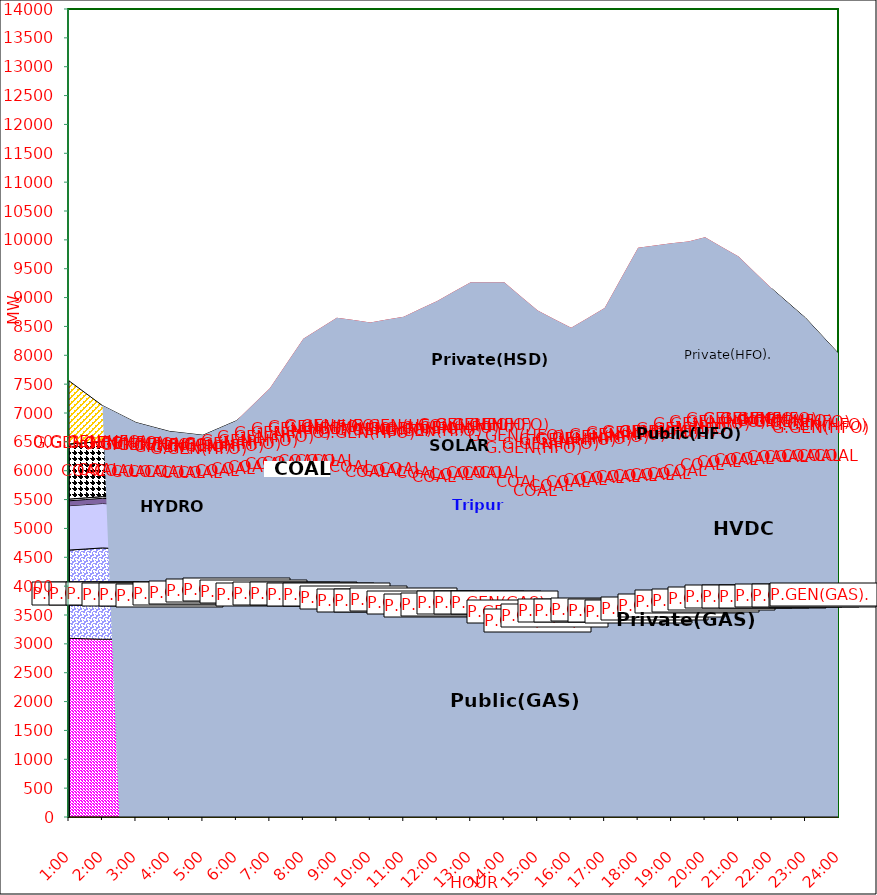
| Category | GAS | P.GEN(GAS). |  HVDC | TRIPURA | HYDRO | COAL | SOLAR | G.GEN(HFO) | P.GEN(HFO). | G.GEN(HSD) | P.GEN(HSD) | SHORTAGE | Total Energy Gen 194.744 MKWHr 
Energy Not Served   10.082 MKWHr 
Energy Requirement     204.826 MKWHr  |
|---|---|---|---|---|---|---|---|---|---|---|---|---|---|
| 1:00 | 3096 | 1529 | 769 | 84 | 30 | 955 | 0 | 0 | 1094 | 0 | 0 | 0 |  |
| 1:30 | 3088 | 1555.5 | 769.5 | 87 | 30 | 955 | 0 | 0 | 857.5 | 0 | 0 | 0 |  |
| 2:00 | 3080 | 1582 | 770 | 90 | 30 | 955 | 0 | 0 | 621 | 0 | 0 | 0 |  |
| 2:30 | 3080.5 | 1567 | 769.5 | 85 | 30 | 955.5 | 0 | 0 | 494 | 0 | 0 | 0 |  |
| 3:00 | 3081 | 1552 | 769 | 80 | 30 | 956 | 0 | 0 | 367 | 0 | 0 | 0 |  |
| 3:30 | 3071.5 | 1558 | 769 | 82 | 30 | 950 | 0 | 0 | 297.5 | 0 | 0 | 0 |  |
| 4:00 | 3062 | 1564 | 769 | 84 | 30 | 944 | 0 | 0 | 228 | 0 | 0 | 0 |  |
| 4:30 | 3088.5 | 1558.5 | 769 | 85 | 30 | 889 | 0 | 0 | 228 | 0 | 0 | 0 |  |
| 5:00 | 3115 | 1553 | 769 | 86 | 30 | 834 | 0 | 0 | 228 | 0 | 0 | 0 |  |
| 5:30 | 3133 | 1568.5 | 769 | 83 | 30 | 844.5 | 0 | 2.5 | 309.5 | 0 | 0 | 0 |  |
| 6:00 | 3151 | 1584 | 769 | 80 | 30 | 855 | 0 | 5 | 391 | 0 | 0 | 0 |  |
| 6:30 | 3118 | 1566 | 840 | 84 | 30 | 884.5 | 1.5 | 14.5 | 562 | 0 | 0 | 46.079 |  |
| 7:00 | 3085 | 1548 | 911 | 88 | 30 | 914 | 3 | 24 | 733 | 0 | 0 | 92.158 |  |
| 7:30 | 3083.5 | 1562.5 | 911 | 93 | 30 | 935.5 | 25.5 | 36 | 825 | 0 | 0 | 356.189 |  |
| 8:00 | 3082 | 1577 | 911 | 98 | 30 | 957 | 48 | 48 | 917 | 0 | 0 | 620.22 |  |
| 8:30 | 3069 | 1586 | 910 | 100 | 30 | 956.5 | 79 | 54.5 | 954 | 0 | 0 | 729.887 |  |
| 9:00 | 3056 | 1595 | 909 | 102 | 30 | 956 | 110 | 61 | 991 | 0 | 0 | 839.555 |  |
| 9:30 | 3042 | 1516 | 909 | 99 | 30 | 956 | 142.5 | 64.5 | 1032 | 0 | 0 | 818.819 |  |
| 10:00 | 3028 | 1437 | 909 | 96 | 30 | 956 | 175 | 68 | 1073 | 0 | 0 | 798.084 |  |
| 10:30 | 3024.5 | 1464.5 | 909 | 100 | 30 | 955.5 | 205 | 66.5 | 1122.5 | 0 | 0 | 740.946 |  |
| 11:00 | 3021 | 1492 | 909 | 104 | 30 | 955 | 235 | 65 | 1172 | 0 | 0 | 683.809 |  |
| 11:30 | 2975.5 | 1473 | 909 | 105 | 30 | 955.5 | 252 | 73.5 | 1131 | 0 | 45 | 855.222 |  |
| 12:00 | 2930 | 1454 | 909 | 106 | 30 | 956 | 269 | 82 | 1090 | 0 | 90 | 1026.635 |  |
| 12:30 | 2956.5 | 1455.5 | 909 | 108 | 30 | 955.5 | 287.5 | 89 | 1083 | 0 | 89.5 | 1140.91 |  |
| 13:00 | 2983 | 1457 | 909 | 110 | 30 | 955 | 306 | 96 | 1076 | 0 | 89 | 1255.185 |  |
| 13:30 | 2983 | 1457 | 909 | 110 | 30 | 955 | 306 | 96 | 1076 | 0 | 89 | 1255.185 |  |
| 14:00 | 2983 | 1457 | 909 | 110 | 30 | 955 | 306 | 96 | 1076 | 0 | 89 | 1255.185 |  |
| 14:30 | 2824 | 1465 | 908.5 | 108 | 30 | 954 | 231 | 165 | 1221 | 0 | 44.5 | 1069.488 |  |
| 15:00 | 2665 | 1473 | 908 | 106 | 30 | 953 | 156 | 234 | 1366 | 0 | 0 | 883.79 |  |
| 15:30 | 2750 | 1472 | 908.5 | 103 | 30 | 953 | 124.5 | 264.5 | 1389 | 0 | 0 | 630.818 |  |
| 16:00 | 2835 | 1471 | 909 | 100 | 30 | 953 | 93 | 295 | 1412 | 0 | 0 | 377.846 |  |
| 16:30 | 2824 | 1510 | 908.5 | 101 | 30 | 953.5 | 56 | 361 | 1569.5 | 0 | 0 | 334.071 |  |
| 17:00 | 2813 | 1549 | 908 | 102 | 30 | 954 | 19 | 427 | 1727 | 0 | 0 | 290.296 |  |
| 17:30 | 2785 | 1584 | 908 | 111.5 | 30 | 954 | 9.5 | 491.5 | 1940.5 | 0 | 40 | 487.974 |  |
| 18:00 | 2757 | 1619 | 908 | 121 | 30 | 954 | 0 | 556 | 2154 | 0 | 80 | 685.652 |  |
| 18:30 | 2796.5 | 1643.5 | 861 | 120.5 | 30 | 954 | 0 | 535 | 2218 | 0 | 70 | 674.326 |  |
| 19:00 | 2836 | 1668 | 814 | 120 | 30 | 954 | 0 | 514 | 2282 | 0 | 60 | 663 |  |
| 19:30 | 2891 | 1682 | 814 | 114 | 30 | 954 | 0 | 485 | 2322 | 0 | 60 | 618 |  |
| 20:00 | 2893 | 1731 | 861 | 114 | 30 | 955 | 0 | 476 | 2352 | 0 | 60 | 573 |  |
| 20:30 | 2912 | 1758 | 860.5 | 113 | 30 | 955 | 0 | 463.5 | 2225.5 | 0 | 45 | 515.5 |  |
| 21:00 | 2931 | 1785 | 860 | 112 | 30 | 955 | 0 | 451 | 2099 | 0 | 30 | 458 |  |
| 21:30 | 2934.5 | 1783 | 884 | 110 | 30 | 955 | 0 | 413 | 2077.5 | 0 | 15 | 229 |  |
| 22:00 | 2938 | 1781 | 908 | 108 | 30 | 955 | 0 | 375 | 2056 | 0 | 0 | 0 |  |
| 22:30 | 2937 | 1795.5 | 907.5 | 107 | 30 | 955 | 0 | 288 | 1879 | 0 | 0 | 0 |  |
| 23:00 | 2936 | 1810 | 907 | 106 | 30 | 955 | 0 | 201 | 1702 | 0 | 0 | 0 |  |
| 23:30 | 2939.5 | 1813 | 907.5 | 101 | 30 | 955.5 | 0 | 108.5 | 1479.5 | 0 | 0 | 0 |  |
| 24:00 | 2943 | 1816 | 908 | 96 | 30 | 956 | 0 | 16 | 1257 | 0 | 0 | 0 |  |